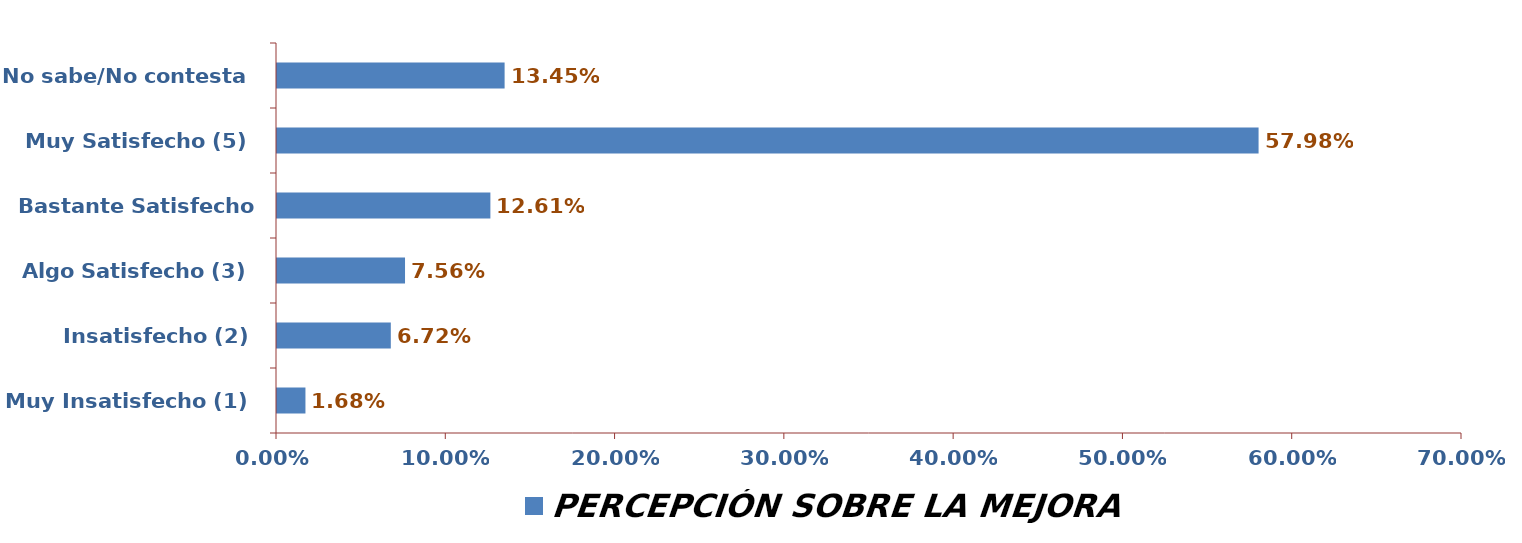
| Category | PERCEPCIÓN SOBRE LA MEJORA |
|---|---|
| Muy Insatisfecho (1) | 0.017 |
| Insatisfecho (2) | 0.067 |
| Algo Satisfecho (3) | 0.076 |
| Bastante Satisfecho (4) | 0.126 |
| Muy Satisfecho (5) | 0.58 |
| No sabe/No contesta | 0.134 |